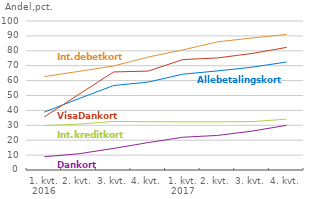
| Category | Betalingskort | Dankort | VisaDankort | Internationale debetkort | Internationale kreditkort |
|---|---|---|---|---|---|
| 1. kvt.
2016 | 38.9 | 8.9 | 35.6 | 62.7 | 29.8 |
| 2. kvt. | 47.9 | 10.9 | 50.8 | 66.2 | 30.8 |
| 3. kvt. | 56.7 | 14.5 | 65.8 | 69.8 | 32.6 |
| 4. kvt. | 59 | 18.4 | 66.4 | 75.8 | 32.4 |
| 1. kvt.
2017 | 64.3 | 22 | 74.1 | 80.6 | 32.3 |
| 2. kvt. | 66.5 | 23.2 | 75.2 | 86 | 32.3 |
| 3. kvt. | 69 | 26.1 | 78.2 | 88.6 | 32.5 |
| 4. kvt. | 72.5 | 30 | 82.3 | 91 | 34.1 |